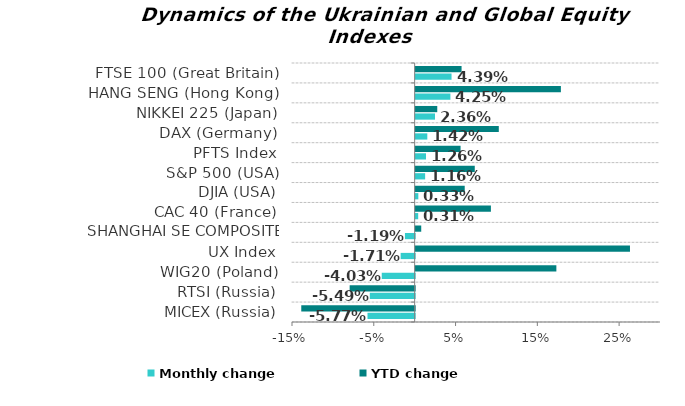
| Category | Monthly change | YTD change |
|---|---|---|
| MICEX (Russia) | -0.058 | -0.139 |
| RTSI (Russia) | -0.055 | -0.079 |
| WIG20 (Poland) | -0.04 | 0.172 |
| UX Index | -0.017 | 0.262 |
| SHANGHAI SE COMPOSITE (China) | -0.012 | 0.007 |
| CAC 40 (France) | 0.003 | 0.092 |
| DJIA (USA) | 0.003 | 0.06 |
| S&P 500 (USA) | 0.012 | 0.072 |
| PFTS Index | 0.013 | 0.055 |
| DAX (Germany) | 0.014 | 0.102 |
| NIKKEI 225 (Japan) | 0.024 | 0.026 |
| HANG SENG (Hong Kong) | 0.042 | 0.178 |
| FTSE 100 (Great Britain) | 0.044 | 0.056 |